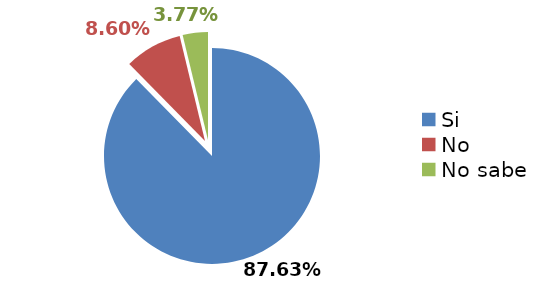
| Category | Series 0 |
|---|---|
| Si | 0.876 |
| No | 0.086 |
| No sabe | 0.038 |